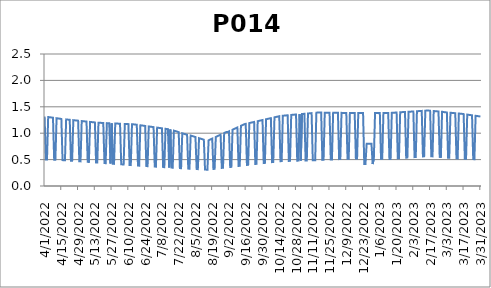
| Category | P014 |
|---|---|
| 4/1/22 | 1.316 |
| 4/2/22 | 0.503 |
| 4/3/22 | 0.502 |
| 4/4/22 | 1.306 |
| 4/5/22 | 1.303 |
| 4/6/22 | 1.3 |
| 4/7/22 | 1.297 |
| 4/8/22 | 1.293 |
| 4/9/22 | 0.497 |
| 4/10/22 | 0.496 |
| 4/11/22 | 1.284 |
| 4/12/22 | 1.28 |
| 4/13/22 | 1.277 |
| 4/14/22 | 1.274 |
| 4/15/22 | 1.27 |
| 4/16/22 | 0.49 |
| 4/17/22 | 0.488 |
| 4/18/22 | 0.487 |
| 4/19/22 | 1.261 |
| 4/20/22 | 1.259 |
| 4/21/22 | 1.256 |
| 4/22/22 | 1.254 |
| 4/23/22 | 0.479 |
| 4/24/22 | 0.477 |
| 4/25/22 | 1.247 |
| 4/26/22 | 1.244 |
| 4/27/22 | 1.242 |
| 4/28/22 | 1.24 |
| 4/29/22 | 1.237 |
| 4/30/22 | 0.468 |
| 5/1/22 | 0.467 |
| 5/2/22 | 1.23 |
| 5/3/22 | 1.228 |
| 5/4/22 | 1.225 |
| 5/5/22 | 1.223 |
| 5/6/22 | 1.221 |
| 5/7/22 | 0.457 |
| 5/8/22 | 0.456 |
| 5/9/22 | 1.213 |
| 5/10/22 | 1.211 |
| 5/11/22 | 1.209 |
| 5/12/22 | 1.206 |
| 5/13/22 | 1.204 |
| 5/14/22 | 0.446 |
| 5/15/22 | 0.445 |
| 5/16/22 | 1.198 |
| 5/17/22 | 1.197 |
| 5/18/22 | 1.196 |
| 5/19/22 | 1.195 |
| 5/20/22 | 1.194 |
| 5/21/22 | 0.434 |
| 5/22/22 | 0.432 |
| 5/23/22 | 1.19 |
| 5/24/22 | 1.189 |
| 5/25/22 | 1.188 |
| 5/26/22 | 0.425 |
| 5/27/22 | 1.186 |
| 5/28/22 | 0.421 |
| 5/29/22 | 0.42 |
| 5/30/22 | 1.183 |
| 5/31/22 | 1.182 |
| 6/1/22 | 1.182 |
| 6/2/22 | 1.181 |
| 6/3/22 | 1.18 |
| 6/4/22 | 0.411 |
| 6/5/22 | 0.409 |
| 6/6/22 | 0.407 |
| 6/7/22 | 1.175 |
| 6/8/22 | 1.174 |
| 6/9/22 | 1.173 |
| 6/10/22 | 1.172 |
| 6/11/22 | 0.398 |
| 6/12/22 | 0.396 |
| 6/13/22 | 1.169 |
| 6/14/22 | 1.168 |
| 6/15/22 | 1.167 |
| 6/16/22 | 1.163 |
| 6/17/22 | 1.16 |
| 6/18/22 | 0.387 |
| 6/19/22 | 0.385 |
| 6/20/22 | 1.15 |
| 6/21/22 | 1.147 |
| 6/22/22 | 1.144 |
| 6/23/22 | 1.141 |
| 6/24/22 | 1.138 |
| 6/25/22 | 0.377 |
| 6/26/22 | 0.376 |
| 6/27/22 | 1.128 |
| 6/28/22 | 1.125 |
| 6/29/22 | 1.122 |
| 6/30/22 | 1.118 |
| 7/1/22 | 1.115 |
| 7/2/22 | 0.368 |
| 7/3/22 | 0.366 |
| 7/4/22 | 1.106 |
| 7/5/22 | 1.102 |
| 7/6/22 | 1.099 |
| 7/7/22 | 1.096 |
| 7/8/22 | 1.093 |
| 7/9/22 | 0.358 |
| 7/10/22 | 0.357 |
| 7/11/22 | 1.083 |
| 7/12/22 | 1.08 |
| 7/13/22 | 1.077 |
| 7/14/22 | 0.351 |
| 7/15/22 | 1.07 |
| 7/16/22 | 0.349 |
| 7/17/22 | 0.347 |
| 7/18/22 | 1.049 |
| 7/19/22 | 1.042 |
| 7/20/22 | 1.034 |
| 7/21/22 | 1.027 |
| 7/22/22 | 1.02 |
| 7/23/22 | 0.339 |
| 7/24/22 | 0.338 |
| 7/25/22 | 0.999 |
| 7/26/22 | 0.992 |
| 7/27/22 | 0.984 |
| 7/28/22 | 0.977 |
| 7/29/22 | 0.97 |
| 7/30/22 | 0.329 |
| 7/31/22 | 0.328 |
| 8/1/22 | 0.956 |
| 8/2/22 | 0.949 |
| 8/3/22 | 0.942 |
| 8/4/22 | 0.934 |
| 8/5/22 | 0.927 |
| 8/6/22 | 0.321 |
| 8/7/22 | 0.32 |
| 8/8/22 | 0.906 |
| 8/9/22 | 0.899 |
| 8/10/22 | 0.892 |
| 8/11/22 | 0.884 |
| 8/12/22 | 0.877 |
| 8/13/22 | 0.311 |
| 8/14/22 | 0.31 |
| 8/15/22 | 0.308 |
| 8/16/22 | 0.866 |
| 8/17/22 | 0.877 |
| 8/18/22 | 0.887 |
| 8/19/22 | 0.898 |
| 8/20/22 | 0.323 |
| 8/21/22 | 0.326 |
| 8/22/22 | 0.929 |
| 8/23/22 | 0.94 |
| 8/24/22 | 0.951 |
| 8/25/22 | 0.961 |
| 8/26/22 | 0.972 |
| 8/27/22 | 0.343 |
| 8/28/22 | 0.345 |
| 8/29/22 | 1.003 |
| 8/30/22 | 1.014 |
| 8/31/22 | 1.024 |
| 9/1/22 | 1.024 |
| 9/2/22 | 1.035 |
| 9/3/22 | 0.36 |
| 9/4/22 | 0.363 |
| 9/5/22 | 1.066 |
| 9/6/22 | 1.077 |
| 9/7/22 | 1.087 |
| 9/8/22 | 1.098 |
| 9/9/22 | 1.108 |
| 9/10/22 | 0.38 |
| 9/11/22 | 0.383 |
| 9/12/22 | 1.14 |
| 9/13/22 | 1.15 |
| 9/14/22 | 1.161 |
| 9/15/22 | 1.172 |
| 9/16/22 | 1.177 |
| 9/17/22 | 0.399 |
| 9/18/22 | 0.402 |
| 9/19/22 | 1.192 |
| 9/20/22 | 1.197 |
| 9/21/22 | 1.203 |
| 9/22/22 | 1.208 |
| 9/23/22 | 1.213 |
| 9/24/22 | 0.417 |
| 9/25/22 | 0.42 |
| 9/26/22 | 1.228 |
| 9/27/22 | 1.234 |
| 9/28/22 | 1.239 |
| 9/29/22 | 1.244 |
| 9/30/22 | 1.249 |
| 10/1/22 | 0.435 |
| 10/2/22 | 0.437 |
| 10/3/22 | 1.265 |
| 10/4/22 | 1.27 |
| 10/5/22 | 1.275 |
| 10/6/22 | 1.28 |
| 10/7/22 | 1.285 |
| 10/8/22 | 0.453 |
| 10/9/22 | 0.455 |
| 10/10/22 | 1.301 |
| 10/11/22 | 1.306 |
| 10/12/22 | 1.311 |
| 10/13/22 | 1.316 |
| 10/14/22 | 1.321 |
| 10/15/22 | 0.471 |
| 10/16/22 | 0.471 |
| 10/17/22 | 1.331 |
| 10/18/22 | 1.333 |
| 10/19/22 | 1.335 |
| 10/20/22 | 1.337 |
| 10/21/22 | 1.339 |
| 10/22/22 | 0.475 |
| 10/23/22 | 0.476 |
| 10/24/22 | 1.346 |
| 10/25/22 | 1.348 |
| 10/26/22 | 1.35 |
| 10/27/22 | 1.352 |
| 10/28/22 | 1.354 |
| 10/29/22 | 0.48 |
| 10/30/22 | 0.481 |
| 10/31/22 | 1.361 |
| 11/1/22 | 0.481 |
| 11/2/22 | 1.363 |
| 11/3/22 | 1.365 |
| 11/4/22 | 1.367 |
| 11/5/22 | 0.484 |
| 11/6/22 | 0.485 |
| 11/7/22 | 1.374 |
| 11/8/22 | 1.376 |
| 11/9/22 | 1.378 |
| 11/10/22 | 1.38 |
| 11/11/22 | 0.488 |
| 11/12/22 | 0.489 |
| 11/13/22 | 0.489 |
| 11/14/22 | 1.389 |
| 11/15/22 | 1.391 |
| 11/16/22 | 1.391 |
| 11/17/22 | 1.39 |
| 11/18/22 | 1.39 |
| 11/19/22 | 0.495 |
| 11/20/22 | 0.496 |
| 11/21/22 | 1.389 |
| 11/22/22 | 1.389 |
| 11/23/22 | 1.389 |
| 11/24/22 | 1.388 |
| 11/25/22 | 1.388 |
| 11/26/22 | 0.502 |
| 11/27/22 | 0.503 |
| 11/28/22 | 1.387 |
| 11/29/22 | 1.387 |
| 11/30/22 | 1.386 |
| 12/1/22 | 1.386 |
| 12/2/22 | 1.386 |
| 12/3/22 | 0.509 |
| 12/4/22 | 0.51 |
| 12/5/22 | 1.385 |
| 12/6/22 | 1.385 |
| 12/7/22 | 1.384 |
| 12/8/22 | 1.384 |
| 12/9/22 | 1.384 |
| 12/10/22 | 0.516 |
| 12/11/22 | 0.517 |
| 12/12/22 | 1.383 |
| 12/13/22 | 1.383 |
| 12/14/22 | 1.382 |
| 12/15/22 | 1.382 |
| 12/16/22 | 1.382 |
| 12/17/22 | 0.521 |
| 12/18/22 | 0.521 |
| 12/19/22 | 1.382 |
| 12/20/22 | 1.382 |
| 12/21/22 | 1.382 |
| 12/22/22 | 1.382 |
| 12/23/22 | 1.383 |
| 12/24/22 | 0.415 |
| 12/25/22 | 0.415 |
| 12/26/22 | 0.8 |
| 12/27/22 | 0.8 |
| 12/28/22 | 0.8 |
| 12/29/22 | 0.8 |
| 12/30/22 | 0.8 |
| 12/31/22 | 0.415 |
| 1/1/23 | 0.517 |
| 1/2/23 | 1.383 |
| 1/3/23 | 1.383 |
| 1/4/23 | 1.383 |
| 1/5/23 | 1.383 |
| 1/6/23 | 1.383 |
| 1/7/23 | 0.515 |
| 1/8/23 | 0.515 |
| 1/9/23 | 1.384 |
| 1/10/23 | 1.384 |
| 1/11/23 | 1.384 |
| 1/12/23 | 1.384 |
| 1/13/23 | 1.384 |
| 1/14/23 | 0.513 |
| 1/15/23 | 0.513 |
| 1/16/23 | 1.386 |
| 1/17/23 | 1.387 |
| 1/18/23 | 1.389 |
| 1/19/23 | 1.39 |
| 1/20/23 | 1.392 |
| 1/21/23 | 0.524 |
| 1/22/23 | 0.526 |
| 1/23/23 | 1.396 |
| 1/24/23 | 1.398 |
| 1/25/23 | 1.399 |
| 1/26/23 | 1.401 |
| 1/27/23 | 1.402 |
| 1/28/23 | 0.536 |
| 1/29/23 | 0.538 |
| 1/30/23 | 1.407 |
| 1/31/23 | 1.409 |
| 2/1/23 | 1.409 |
| 2/2/23 | 1.41 |
| 2/3/23 | 1.412 |
| 2/4/23 | 0.547 |
| 2/5/23 | 0.549 |
| 2/6/23 | 1.416 |
| 2/7/23 | 1.418 |
| 2/8/23 | 1.419 |
| 2/9/23 | 1.421 |
| 2/10/23 | 1.422 |
| 2/11/23 | 0.56 |
| 2/12/23 | 0.562 |
| 2/13/23 | 1.427 |
| 2/14/23 | 1.428 |
| 2/15/23 | 1.43 |
| 2/16/23 | 1.428 |
| 2/17/23 | 1.426 |
| 2/18/23 | 0.563 |
| 2/19/23 | 0.561 |
| 2/20/23 | 1.42 |
| 2/21/23 | 1.418 |
| 2/22/23 | 1.416 |
| 2/23/23 | 1.414 |
| 2/24/23 | 1.412 |
| 2/25/23 | 0.551 |
| 2/26/23 | 0.549 |
| 2/27/23 | 1.405 |
| 2/28/23 | 1.403 |
| 3/1/23 | 1.397 |
| 3/2/23 | 1.395 |
| 3/3/23 | 1.393 |
| 3/4/23 | 0.536 |
| 3/5/23 | 0.535 |
| 3/6/23 | 1.387 |
| 3/7/23 | 1.385 |
| 3/8/23 | 1.383 |
| 3/9/23 | 1.381 |
| 3/10/23 | 1.379 |
| 3/11/23 | 0.525 |
| 3/12/23 | 0.523 |
| 3/13/23 | 1.373 |
| 3/14/23 | 1.371 |
| 3/15/23 | 1.369 |
| 3/16/23 | 1.365 |
| 3/17/23 | 1.362 |
| 3/18/23 | 0.515 |
| 3/19/23 | 0.515 |
| 3/20/23 | 1.352 |
| 3/21/23 | 1.349 |
| 3/22/23 | 1.346 |
| 3/23/23 | 1.342 |
| 3/24/23 | 1.339 |
| 3/25/23 | 0.509 |
| 3/26/23 | 0.508 |
| 3/27/23 | 1.329 |
| 3/28/23 | 1.326 |
| 3/29/23 | 1.323 |
| 3/30/23 | 1.32 |
| 3/31/23 | 1.316 |